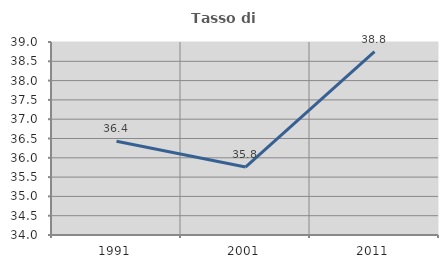
| Category | Tasso di occupazione   |
|---|---|
| 1991.0 | 36.428 |
| 2001.0 | 35.761 |
| 2011.0 | 38.753 |